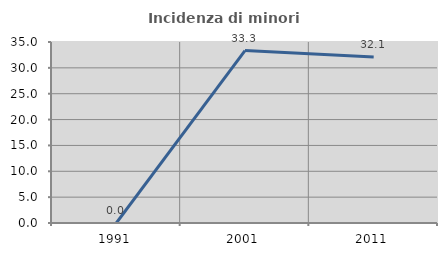
| Category | Incidenza di minori stranieri |
|---|---|
| 1991.0 | 0 |
| 2001.0 | 33.333 |
| 2011.0 | 32.11 |